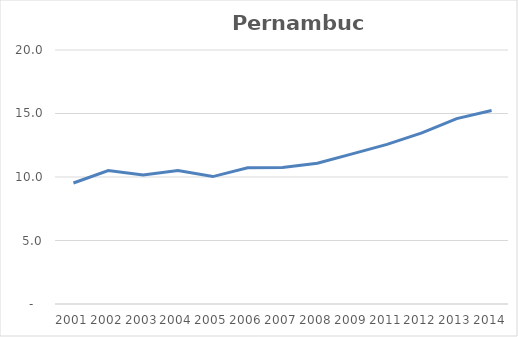
| Category | Total |
|---|---|
| 2001.0 | 9.526 |
| 2002.0 | 10.513 |
| 2003.0 | 10.15 |
| 2004.0 | 10.509 |
| 2005.0 | 10.033 |
| 2006.0 | 10.719 |
| 2007.0 | 10.741 |
| 2008.0 | 11.09 |
| 2009.0 | 11.822 |
| 2011.0 | 12.569 |
| 2012.0 | 13.471 |
| 2013.0 | 14.601 |
| 2014.0 | 15.236 |